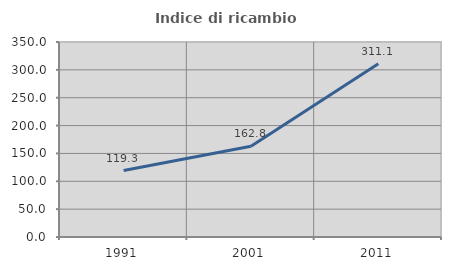
| Category | Indice di ricambio occupazionale  |
|---|---|
| 1991.0 | 119.305 |
| 2001.0 | 162.81 |
| 2011.0 | 311.111 |